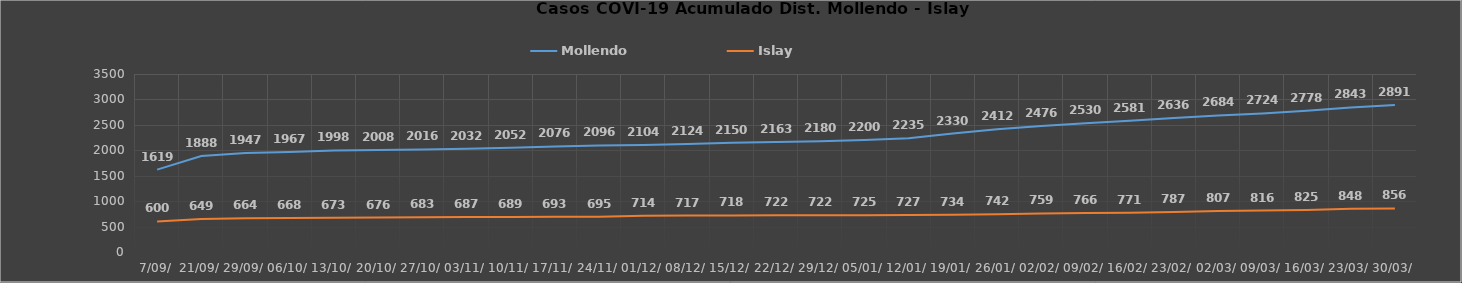
| Category | Mollendo | Islay |
|---|---|---|
| 7/09/ | 1619 | 600 |
| 21/09/ | 1888 | 649 |
| 29/09/ | 1947 | 664 |
| 06/10/ | 1967 | 668 |
| 13/10/ | 1998 | 673 |
| 20/10/ | 2008 | 676 |
| 27/10/ | 2016 | 683 |
| 03/11/ | 2032 | 687 |
| 10/11/ | 2052 | 689 |
| 17/11/ | 2076 | 693 |
| 24/11/ | 2096 | 695 |
| 01/12/ | 2104 | 714 |
| 08/12/ | 2124 | 717 |
| 15/12/ | 2150 | 718 |
| 22/12/ | 2163 | 722 |
| 29/12/ | 2180 | 722 |
| 05/01/ | 2200 | 725 |
| 12/01/ | 2235 | 727 |
| 19/01/ | 2330 | 734 |
| 26/01/ | 2412 | 742 |
| 02/02/ | 2476 | 759 |
| 09/02/ | 2530 | 766 |
| 16/02/ | 2581 | 771 |
| 23/02/ | 2636 | 787 |
| 02/03/ | 2684 | 807 |
| 09/03/ | 2724 | 816 |
| 16/03/ | 2778 | 825 |
| 23/03/ | 2843 | 848 |
| 30/03/ | 2891 | 856 |